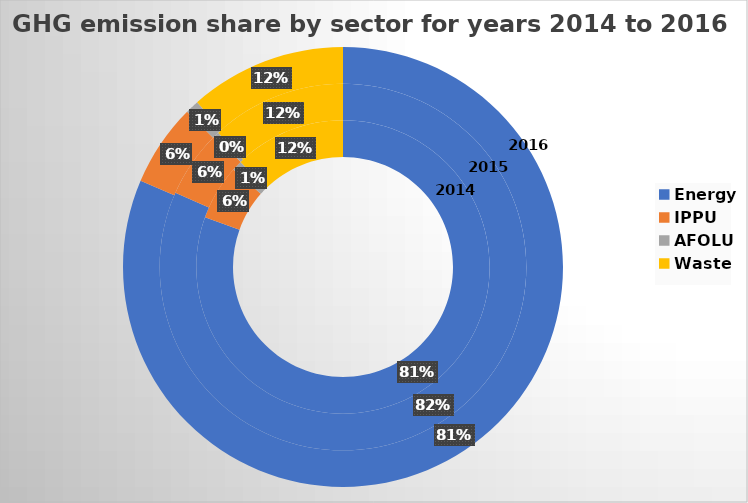
| Category | 2014 | 2015 | 2016 |
|---|---|---|---|
| Energy | 3990.894 | 4043.994 | 4182.617 |
| IPPU | 300.784 | 300.956 | 311.181 |
| AFOLU | 55.204 | 17.987 | 51.177 |
| Waste | 610.348 | 590.735 | 592.809 |